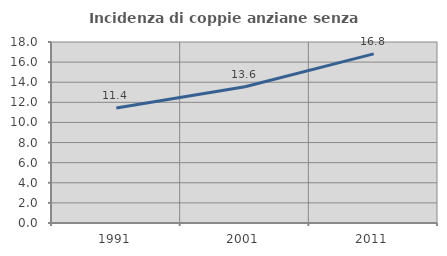
| Category | Incidenza di coppie anziane senza figli  |
|---|---|
| 1991.0 | 11.429 |
| 2001.0 | 13.554 |
| 2011.0 | 16.82 |